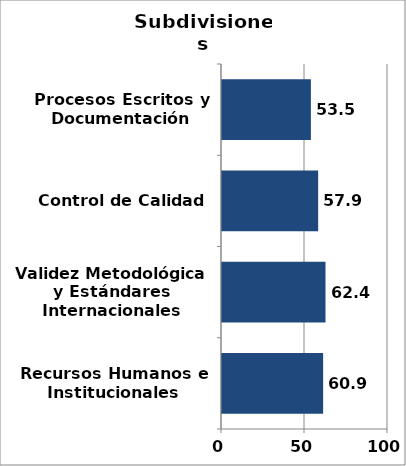
| Category | Series 0 |
|---|---|
| Recursos Humanos e Institucionales | 60.92 |
| Validez Metodológica y Estándares Internacionales | 62.354 |
| Control de Calidad | 57.922 |
| Procesos Escritos y Documentación | 53.549 |